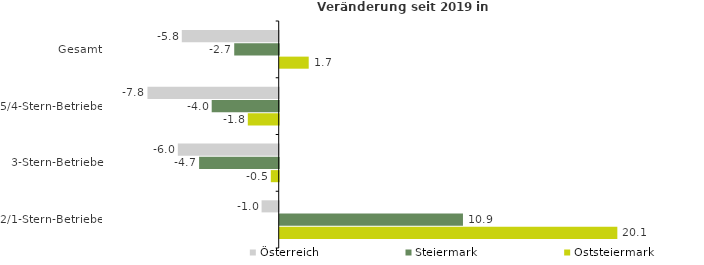
| Category | Österreich | Steiermark | Oststeiermark |
|---|---|---|---|
| Gesamt | -5.779 | -2.653 | 1.729 |
| 5/4-Stern-Betriebe | -7.825 | -3.996 | -1.843 |
| 3-Stern-Betriebe | -6.014 | -4.748 | -0.471 |
| 2/1-Stern-Betriebe | -1.021 | 10.926 | 20.131 |